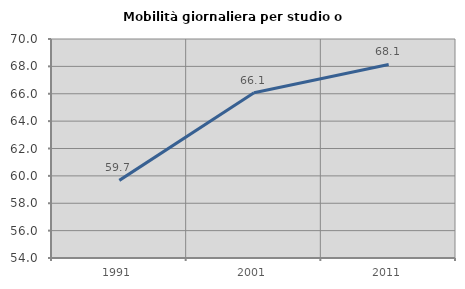
| Category | Mobilità giornaliera per studio o lavoro |
|---|---|
| 1991.0 | 59.671 |
| 2001.0 | 66.066 |
| 2011.0 | 68.142 |